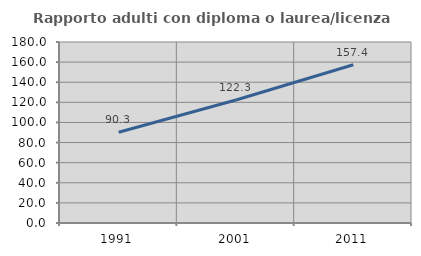
| Category | Rapporto adulti con diploma o laurea/licenza media  |
|---|---|
| 1991.0 | 90.278 |
| 2001.0 | 122.287 |
| 2011.0 | 157.376 |